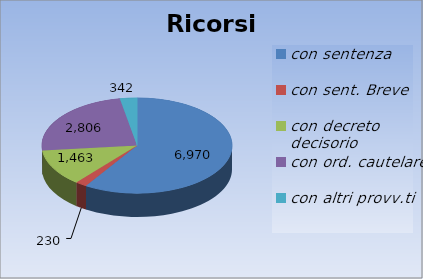
| Category | Ricorsi definiti |
|---|---|
| con sentenza | 6970 |
| con sent. Breve | 230 |
| con decreto decisorio | 1463 |
| con ord. cautelare | 2806 |
| con altri provv.ti | 342 |